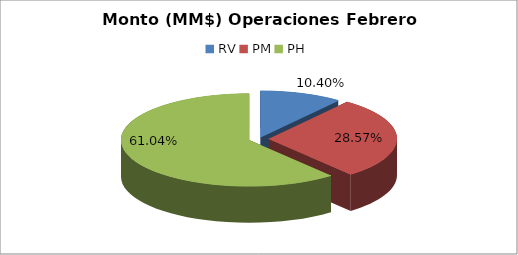
| Category | Series 0 |
|---|---|
| RV | 1061199.219 |
| PM | 2915830.381 |
| PH | 6230064.605 |